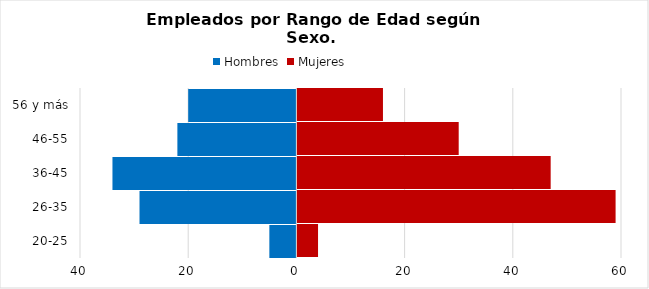
| Category | Hombres | Mujeres |
|---|---|---|
| 20-25 | -5 | 4 |
| 26-35 | -29 | 59 |
| 36-45 | -34 | 47 |
| 46-55 | -22 | 30 |
| 56 y más | -20 | 16 |